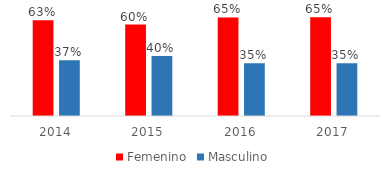
| Category | Femenino | Masculino |
|---|---|---|
| 2014.0 | 0.632 | 0.368 |
| 2015.0 | 0.604 | 0.396 |
| 2016.0 | 0.651 | 0.349 |
| 2017.0 | 0.652 | 0.348 |